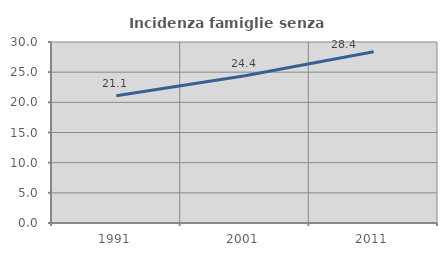
| Category | Incidenza famiglie senza nuclei |
|---|---|
| 1991.0 | 21.077 |
| 2001.0 | 24.404 |
| 2011.0 | 28.372 |